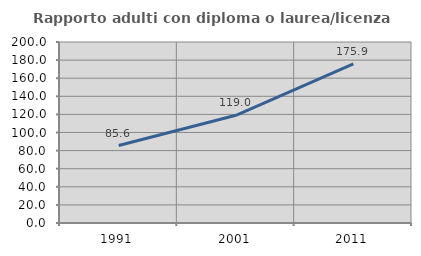
| Category | Rapporto adulti con diploma o laurea/licenza media  |
|---|---|
| 1991.0 | 85.625 |
| 2001.0 | 119.034 |
| 2011.0 | 175.892 |